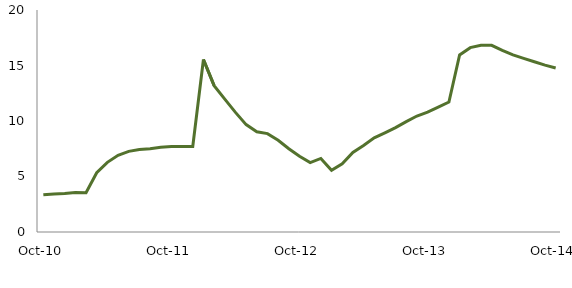
| Category | Series 0 |
|---|---|
| Oct-10 | 3.347 |
|  | 3.43 |
|  | 3.472 |
|  | 3.551 |
|  | 3.547 |
|  | 5.335 |
|  | 6.272 |
|  | 6.917 |
|  | 7.265 |
|  | 7.425 |
|  | 7.496 |
|  | 7.639 |
| Oct-11 | 7.691 |
|  | 7.692 |
|  | 7.708 |
|  | 15.54 |
|  | 13.188 |
|  | 11.966 |
|  | 10.775 |
|  | 9.674 |
|  | 9.035 |
|  | 8.864 |
|  | 8.265 |
|  | 7.496 |
| Oct-12 | 6.818 |
|  | 6.25 |
|  | 6.627 |
|  | 5.561 |
|  | 6.138 |
|  | 7.165 |
|  | 7.793 |
|  | 8.48 |
|  | 8.939 |
|  | 9.399 |
|  | 9.944 |
|  | 10.447 |
| Oct-13 | 10.799 |
|  | 11.252 |
|  | 11.714 |
|  | 15.952 |
|  | 16.607 |
|  | 16.821 |
|  | 16.817 |
|  | 16.37 |
|  | 15.96 |
|  | 15.645 |
|  | 15.343 |
|  | 15.031 |
| Oct-14 | 14.773 |